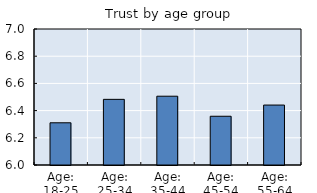
| Category | Self-reported trust in others |
|---|---|
| Age: 18-25 | 6.31 |
| Age: 25-34 | 6.483 |
| Age: 35-44 | 6.506 |
| Age: 45-54 | 6.358 |
| Age: 55-64 | 6.441 |